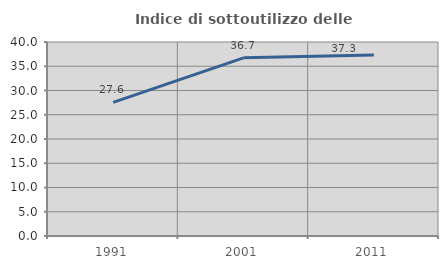
| Category | Indice di sottoutilizzo delle abitazioni  |
|---|---|
| 1991.0 | 27.554 |
| 2001.0 | 36.738 |
| 2011.0 | 37.301 |